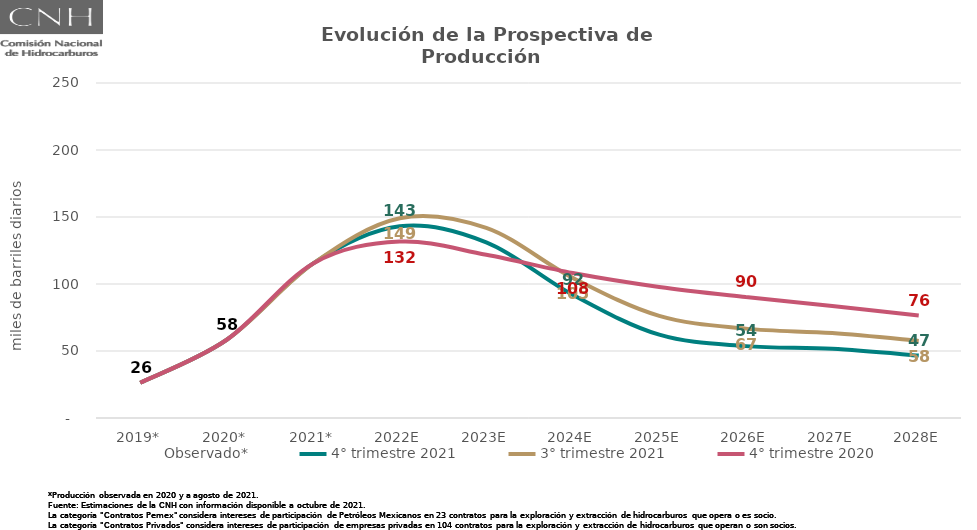
| Category | Observado* | 4° trimestre 2021 | 3° trimestre 2021 | 4° trimestre 2020 |
|---|---|---|---|---|
| 2019* | 26.35 | 26.35 | 26.35 | 26.35 |
| 2020* | 58.4 | 58.4 | 58.4 | 58.4 |
| 2021* | 115.364 | 115.364 | 115.364 | 115.364 |
| 2022E | 143.035 | 143.035 | 149.117 | 131.65 |
| 2023E | 131.133 | 131.133 | 141.852 | 121.8 |
| 2024E | 92.005 | 92.005 | 104.59 | 108.242 |
| 2025E | 62.171 | 62.171 | 76.217 | 97.834 |
| 2026E | 53.634 | 53.634 | 66.704 | 90.286 |
| 2027E | 51.61 | 51.61 | 63.356 | 83.585 |
| 2028E | 46.584 | 46.584 | 57.555 | 76.444 |